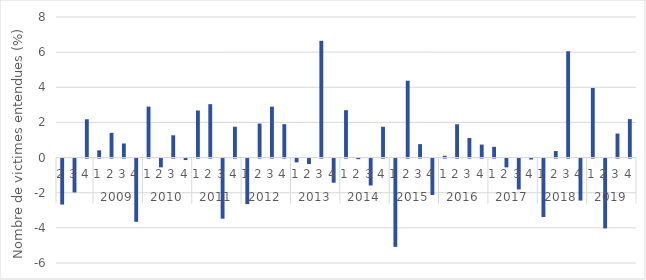
| Category | évolution trimestrielle (%) |
|---|---|
| 0 | -2.618 |
| 1 | -1.924 |
| 2 | 2.181 |
| 3 | 0.412 |
| 4 | 1.409 |
| 5 | 0.802 |
| 6 | -3.599 |
| 7 | 2.901 |
| 8 | -0.5 |
| 9 | 1.268 |
| 10 | -0.084 |
| 11 | 2.679 |
| 12 | 3.039 |
| 13 | -3.419 |
| 14 | 1.754 |
| 15 | -2.594 |
| 16 | 1.932 |
| 17 | 2.897 |
| 18 | 1.902 |
| 19 | -0.216 |
| 20 | -0.309 |
| 21 | 6.645 |
| 22 | -1.375 |
| 23 | 2.697 |
| 24 | -0.036 |
| 25 | -1.533 |
| 26 | 1.752 |
| 27 | -5.024 |
| 28 | 4.375 |
| 29 | 0.764 |
| 30 | -2.072 |
| 31 | 0.104 |
| 32 | 1.896 |
| 33 | 1.112 |
| 34 | 0.74 |
| 35 | 0.612 |
| 36 | -0.502 |
| 37 | -1.758 |
| 38 | -0.054 |
| 39 | -3.324 |
| 40 | 0.371 |
| 41 | 6.05 |
| 42 | -2.391 |
| 43 | 3.962 |
| 44 | -3.971 |
| 45 | 1.367 |
| 46 | 2.19 |